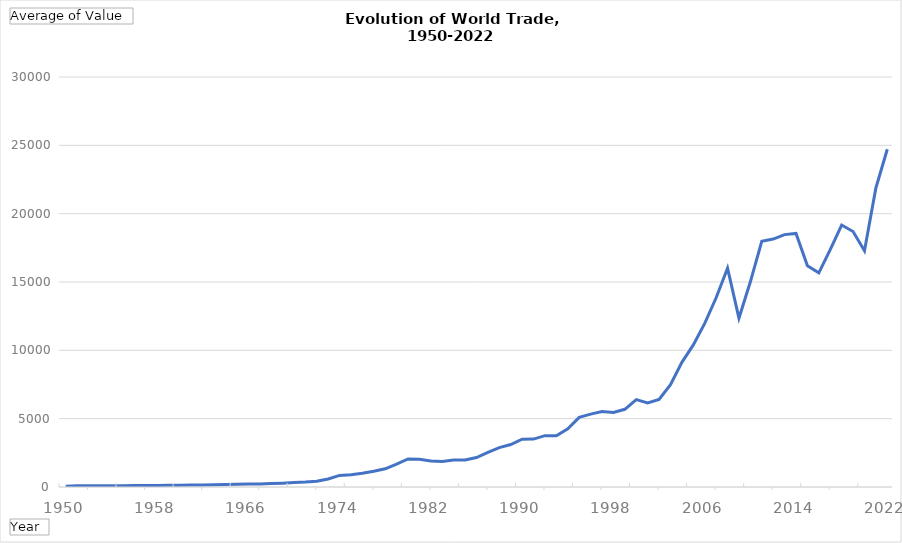
| Category | World excluding Hong Kong re-exports |
|---|---|
| 1950 | 62.925 |
| 1951 | 86.035 |
| 1952 | 84.86 |
| 1953 | 84.44 |
| 1954 | 87.75 |
| 1955 | 96.805 |
| 1956 | 107.18 |
| 1957 | 117.475 |
| 1958 | 112.525 |
| 1959 | 120.75 |
| 1960 | 133.61 |
| 1961 | 139.28 |
| 1962 | 146.76 |
| 1963 | 160.185 |
| 1964 | 179.28 |
| 1965 | 194.195 |
| 1966 | 212.335 |
| 1967 | 222.83 |
| 1968 | 247.025 |
| 1969 | 281.275 |
| 1970 | 322.675 |
| 1971 | 359.545 |
| 1972 | 425.195 |
| 1973 | 586.25 |
| 1974 | 849.405 |
| 1975 | 893.015 |
| 1976 | 1007.1 |
| 1977 | 1147.34 |
| 1978 | 1329.86 |
| 1979 | 1672.505 |
| 1980 | 2050.022 |
| 1981 | 2034.973 |
| 1982 | 1907.177 |
| 1983 | 1860.575 |
| 1984 | 1974.986 |
| 1985 | 1970.725 |
| 1986 | 2156.711 |
| 1987 | 2525.94 |
| 1988 | 2881.486 |
| 1989 | 3107.584 |
| 1990 | 3494.41 |
| 1991 | 3504.695 |
| 1992 | 3756.265 |
| 1993 | 3746.485 |
| 1994 | 4263.946 |
| 1995 | 5092.785 |
| 1996 | 5335.154 |
| 1997 | 5516.634 |
| 1998 | 5455.757 |
| 1999 | 5685.696 |
| 2000 | 6390.092 |
| 2001 | 6147.918 |
| 2002 | 6412.517 |
| 2003 | 7490.278 |
| 2004 | 9123.75 |
| 2005 | 10399.298 |
| 2006 | 11975.847 |
| 2007 | 13846.995 |
| 2008 | 16009.683 |
| 2009 | 12352.269 |
| 2010 | 15013.052 |
| 2011 | 17978.733 |
| 2012 | 18141.723 |
| 2013 | 18466.749 |
| 2014 | 18553.015 |
| 2015 | 16184.496 |
| 2016 | 15666.857 |
| 2017 | 17367.201 |
| 2018 | 19169.709 |
| 2019 | 18695.929 |
| 2020 | 17290.059 |
| 2021 | 21881.071 |
| 2022 | 24714.991 |